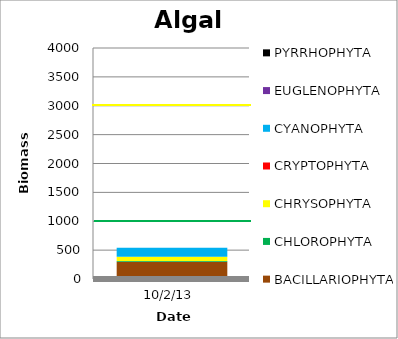
| Category | BACILLARIOPHYTA | CHLOROPHYTA | CHRYSOPHYTA | CRYPTOPHYTA | CYANOPHYTA | EUGLENOPHYTA | PYRRHOPHYTA |
|---|---|---|---|---|---|---|---|
| 10/2/13 | 297.6 | 14.4 | 72 | 0 | 156 | 0 | 0 |